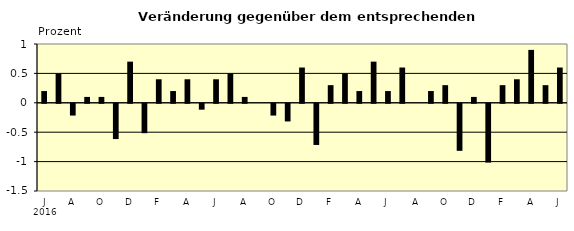
| Category | Series 0 |
|---|---|
| 0 | 0.2 |
| 1 | 0.5 |
| 2 | -0.2 |
| 3 | 0.1 |
| 4 | 0.1 |
| 5 | -0.6 |
| 6 | 0.7 |
| 7 | -0.5 |
| 8 | 0.4 |
| 9 | 0.2 |
| 10 | 0.4 |
| 11 | -0.1 |
| 12 | 0.4 |
| 13 | 0.5 |
| 14 | 0.1 |
| 15 | 0 |
| 16 | -0.2 |
| 17 | -0.3 |
| 18 | 0.6 |
| 19 | -0.7 |
| 20 | 0.3 |
| 21 | 0.5 |
| 22 | 0.2 |
| 23 | 0.7 |
| 24 | 0.2 |
| 25 | 0.6 |
| 26 | 0 |
| 27 | 0.2 |
| 28 | 0.3 |
| 29 | -0.8 |
| 30 | 0.1 |
| 31 | -1 |
| 32 | 0.3 |
| 33 | 0.4 |
| 34 | 0.9 |
| 35 | 0.3 |
| 36 | 0.6 |